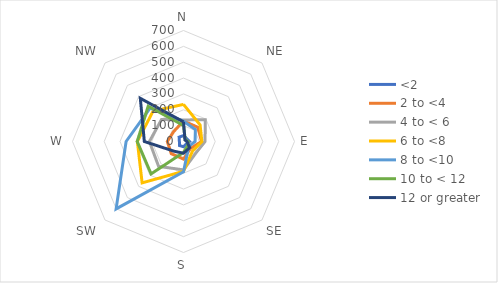
| Category | <2 | 2 to <4 | 4 to < 6 | 6 to <8 | 8 to <10 | 10 to < 12 | 12 or greater |
|---|---|---|---|---|---|---|---|
| N | 37 | 130 | 136 | 234 | 128 | 101 | 124 |
| NE | 27 | 127 | 194 | 148 | 106 | 16 | 13 |
| E | 38 | 114 | 136 | 116 | 73 | 30 | 22 |
| SE | 23 | 62 | 107 | 82 | 46 | 37 | 55 |
| S | 33 | 111 | 179 | 188 | 191 | 69 | 74 |
| SW | 36 | 109 | 222 | 369 | 601 | 289 | 86 |
| W | 26 | 102 | 215 | 291 | 362 | 292 | 247 |
| NW | 39 | 88 | 196 | 271 | 298 | 315 | 385 |